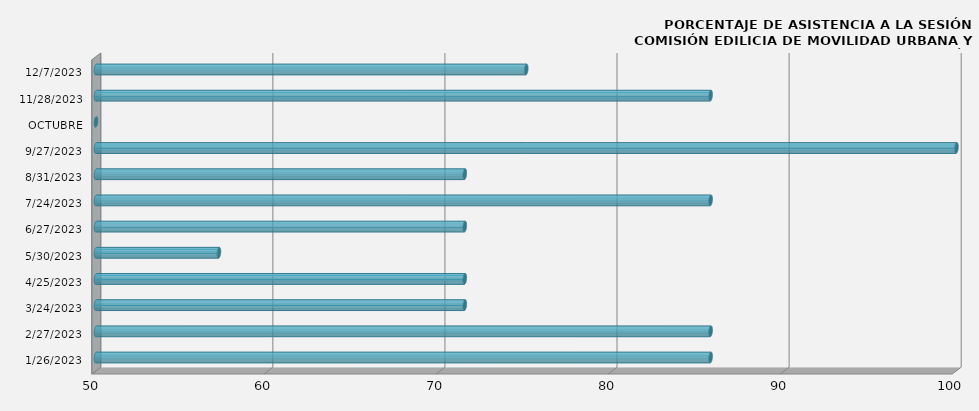
| Category | Series 0 |
|---|---|
| 26/01/2023 | 85.714 |
| 27/02/2023 | 85.714 |
| 24/03/2023 | 71.429 |
| 25/04/2023 | 71.429 |
| 30/05/2023 | 57.143 |
| 27/06/2023 | 71.429 |
| 24/07/2023 | 85.714 |
| 31/08/2023 | 71.429 |
| 27/09/2023 | 100 |
| OCTUBRE | 0 |
| 28/11/2023 | 85.714 |
| 07/12/2023 | 75 |